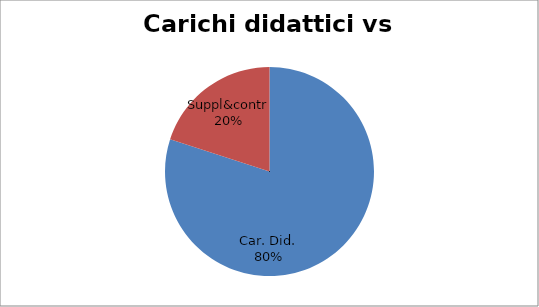
| Category | Series 0 |
|---|---|
| Car. Did. | 0.8 |
| Suppl&contr | 0.2 |